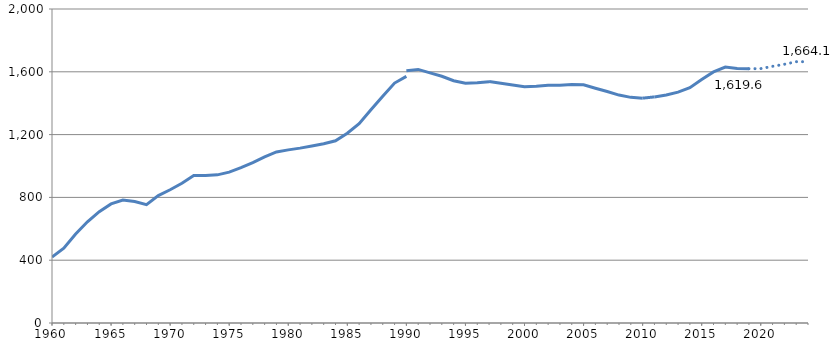
| Category | Lycée GT |
|---|---|
| 1960.0 | 420.308 |
| 1961.0 | 476.435 |
| 1962.0 | 566.997 |
| 1963.0 | 644.466 |
| 1964.0 | 709.349 |
| 1965.0 | 758.395 |
| 1966.0 | 783.019 |
| 1967.0 | 773.582 |
| 1968.0 | 753.959 |
| 1969.0 | 811.488 |
| 1970.0 | 848.675 |
| 1971.0 | 890.106 |
| 1972.0 | 939.131 |
| 1973.0 | 938.729 |
| 1974.0 | 943.532 |
| 1975.0 | 960.822 |
| 1976.0 | 989.202 |
| 1977.0 | 1022.065 |
| 1978.0 | 1058.11 |
| 1979.0 | 1089.752 |
| 1980.0 | 1102.611 |
| 1981.0 | 1113.787 |
| 1982.0 | 1127.346 |
| 1983.0 | 1141.719 |
| 1984.0 | 1160.332 |
| 1985.0 | 1208.906 |
| 1986.0 | 1269.648 |
| 1987.0 | 1358.03 |
| 1988.0 | 1444.185 |
| 1989.0 | 1528.247 |
| 1990.0 | 1570.976 |
| 1990.0 | 1607.419 |
| 1991.0 | 1615.201 |
| 1992.0 | 1593.474 |
| 1993.0 | 1571.765 |
| 1994.0 | 1542.992 |
| 1995.0 | 1526.538 |
| 1996.0 | 1529.84 |
| 1997.0 | 1536.754 |
| 1997.0 | 1538.134 |
| 1998.0 | 1526.911 |
| 1999.0 | 1515.517 |
| 2000.0 | 1504.359 |
| 2001.0 | 1507.627 |
| 2002.0 | 1513.602 |
| 2003.0 | 1515.103 |
| 2004.0 | 1519.46 |
| 2005.0 | 1516.827 |
| 2006.0 | 1495.22 |
| 2007.0 | 1474.385 |
| 2008.0 | 1451.806 |
| 2009.0 | 1437.164 |
| 2010.0 | 1432.195 |
| 2011.0 | 1440.007 |
| 2012.0 | 1452.155 |
| 2013.0 | 1470.561 |
| 2014.0 | 1498.897 |
| 2015.0 | 1550.877 |
| 2016.0 | 1599.157 |
| 2017.0 | 1630.461 |
| 2018.0 | 1621.758 |
| 2019.0 | 1619.564 |
| 2020.0 | 1620.206 |
| 2021.0 | 1634.87 |
| 2022.0 | 1647.921 |
| 2023.0 | 1664.394 |
| 2024.0 | 1664.104 |